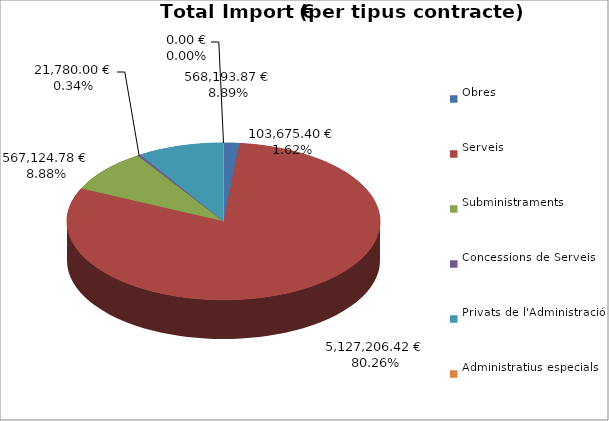
| Category | Total preu
(amb IVA) |
|---|---|
| Obres | 103675.4 |
| Serveis | 5127206.423 |
| Subministraments | 567124.78 |
| Concessions de Serveis | 21780 |
| Privats de l'Administració | 568193.87 |
| Administratius especials | 0 |